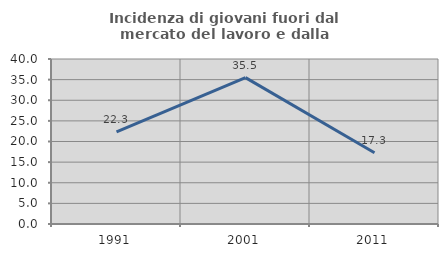
| Category | Incidenza di giovani fuori dal mercato del lavoro e dalla formazione  |
|---|---|
| 1991.0 | 22.338 |
| 2001.0 | 35.493 |
| 2011.0 | 17.266 |